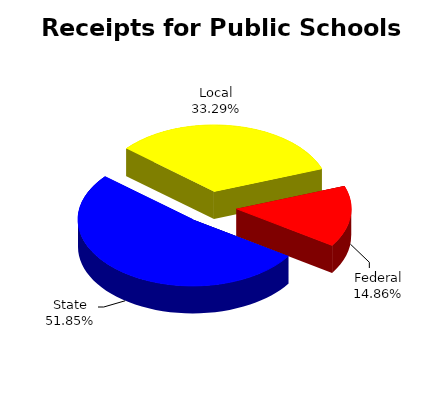
| Category | Series 0 |
|---|---|
| Federal | 0.149 |
| State | 0.518 |
| Local | 0.333 |